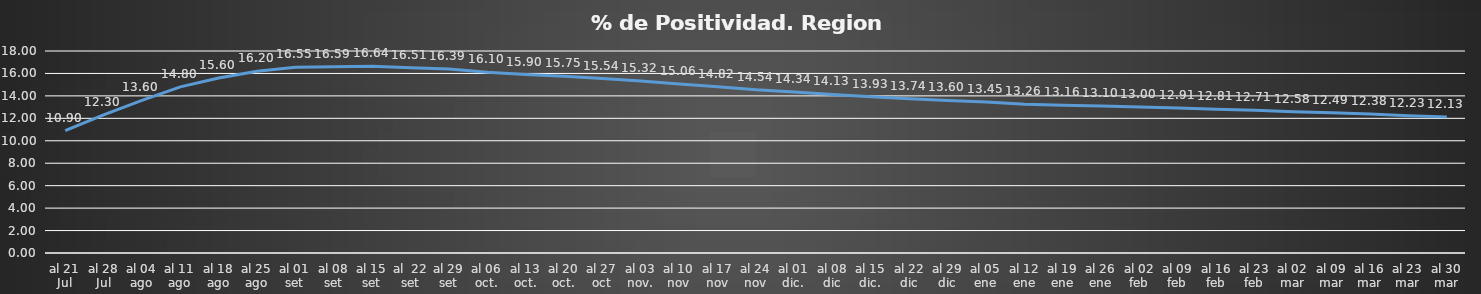
| Category | Series 0 |
|---|---|
| al 21 Jul | 10.9 |
| al 28 Jul | 12.3 |
| al 04 ago | 13.6 |
| al 11 ago | 14.8 |
| al 18 ago | 15.6 |
| al 25 ago | 16.2 |
| al 01 set | 16.55 |
| al 08 set | 16.59 |
| al 15 set | 16.64 |
| al  22 set | 16.51 |
| al 29 set | 16.39 |
| al 06 oct. | 16.1 |
| al 13 oct. | 15.9 |
| al 20 oct. | 15.75 |
| al 27 oct | 15.54 |
| al 03 nov. | 15.32 |
| al 10 nov | 15.06 |
| al 17 nov | 14.82 |
| al 24 nov | 14.54 |
| al 01 dic. | 14.34 |
| al 08 dic | 14.13 |
| al 15 dic. | 13.93 |
| al 22 dic | 13.74 |
| al 29 dic | 13.6 |
| al 05 ene | 13.45 |
| al 12 ene | 13.26 |
| al 19 ene | 13.16 |
| al 26 ene | 13.1 |
| al 02 feb | 13 |
| al 09 feb | 12.91 |
| al 16 feb | 12.81 |
| al 23 feb | 12.71 |
| al 02 mar | 12.58 |
| al 09 mar | 12.49 |
| al 16 mar | 12.38 |
| al 23 mar | 12.23 |
| al 30 mar | 12.13 |